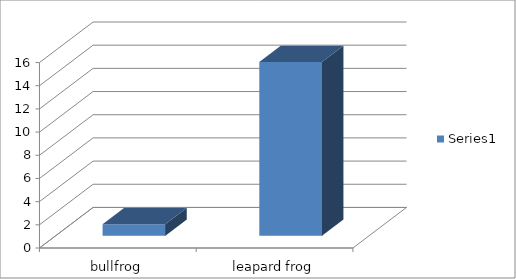
| Category | Series 0 |
|---|---|
| bullfrog | 1 |
| leapard frog | 15 |